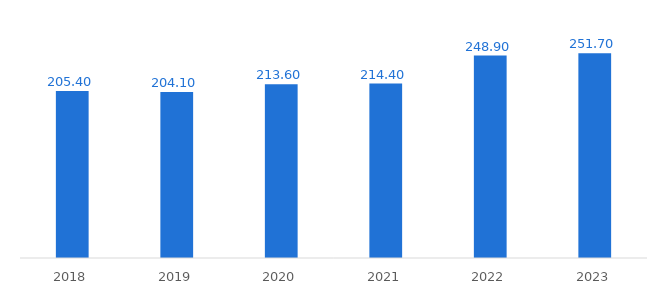
| Category | Arrecadação federal |
|---|---|
| 2023.0 | 251.7 |
| 2022.0 | 248.9 |
| 2021.0 | 214.4 |
| 2020.0 | 213.6 |
| 2019.0 | 204.1 |
| 2018.0 | 205.4 |